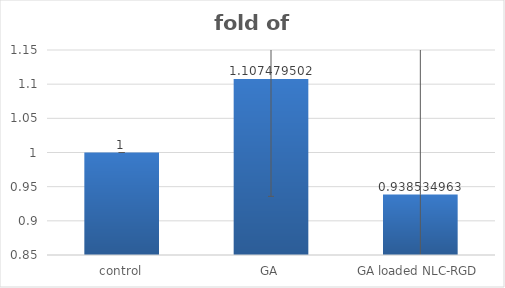
| Category | fold of control |
|---|---|
| control | 1 |
| GA | 1.107 |
| GA loaded NLC-RGD | 0.939 |